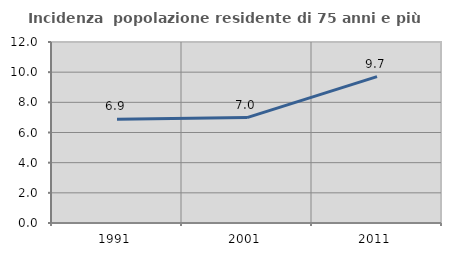
| Category | Incidenza  popolazione residente di 75 anni e più |
|---|---|
| 1991.0 | 6.884 |
| 2001.0 | 6.989 |
| 2011.0 | 9.709 |